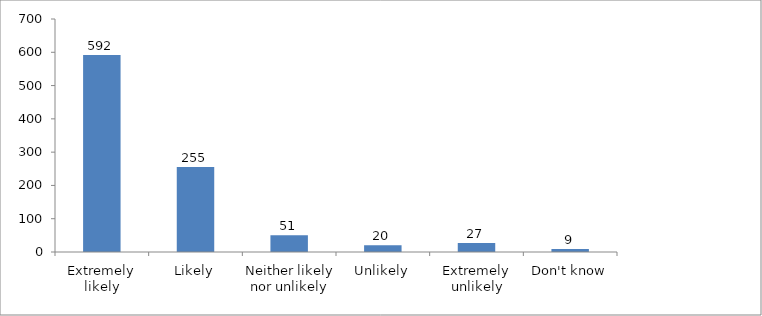
| Category | Series 0 |
|---|---|
| Extremely likely | 592 |
| Likely | 255 |
| Neither likely nor unlikely | 50 |
| Unlikely | 20 |
| Extremely unlikely | 27 |
| Don't know | 9 |